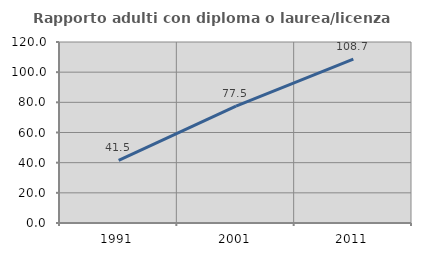
| Category | Rapporto adulti con diploma o laurea/licenza media  |
|---|---|
| 1991.0 | 41.525 |
| 2001.0 | 77.531 |
| 2011.0 | 108.656 |